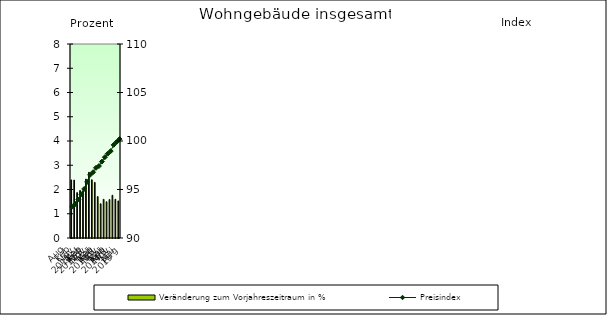
| Category | Veränderung zum Vorjahreszeitraum in % |
|---|---|
| 0 | 2.395 |
| 1 | 2.388 |
| 2 | 1.872 |
| 3 | 1.961 |
| 4 | 1.949 |
| 5 | 2.43 |
| 6 | 2.708 |
| 7 | 2.404 |
| 8 | 2.294 |
| 9 | 1.708 |
| 10 | 1.412 |
| 11 | 1.596 |
| 12 | 1.495 |
| 13 | 1.586 |
| 14 | 1.764 |
| 15 | 1.599 |
| 16 | 1.529 |